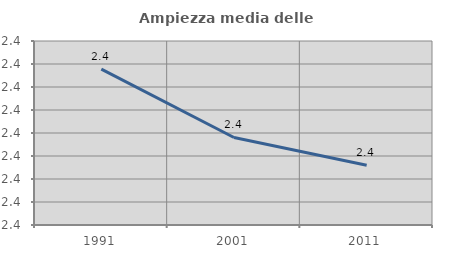
| Category | Ampiezza media delle famiglie |
|---|---|
| 1991.0 | 2.428 |
| 2001.0 | 2.398 |
| 2011.0 | 2.386 |